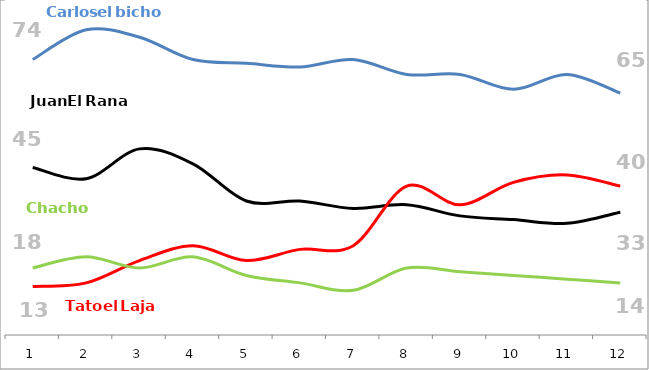
| Category | Carlos El Bicho | Juan el Rana | Tato El Laja | Chacho |
|---|---|---|---|---|
| 0 | 74 | 45 | 13 | 18 |
| 1 | 82 | 42 | 14 | 21 |
| 2 | 80 | 50 | 20 | 18 |
| 3 | 74 | 46 | 24 | 21 |
| 4 | 73 | 36 | 20 | 16 |
| 5 | 72 | 36 | 23 | 14 |
| 6 | 74 | 34 | 24 | 12 |
| 7 | 70 | 35 | 40 | 18 |
| 8 | 70 | 32 | 35 | 17 |
| 9 | 66 | 31 | 41 | 16 |
| 10 | 70 | 30 | 43 | 15 |
| 11 | 65 | 33 | 40 | 14 |